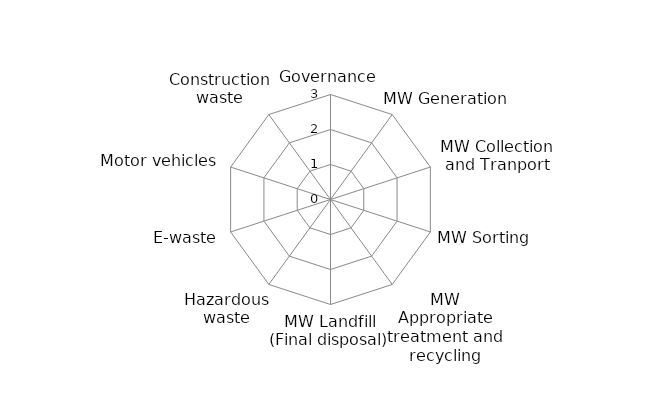
| Category | Series 0 |
|---|---|
| Governance | 0 |
| MW Generation | 0 |
| MW Collection and Tranport | 0 |
| MW Sorting | 0 |
| MW Appropriate treatment and recycling | 0 |
| MW Landfill (Final disposal) | 0 |
| Hazardous waste | 0 |
| E-waste | 0 |
| Motor vehicles | 0 |
| Construction waste | 0 |